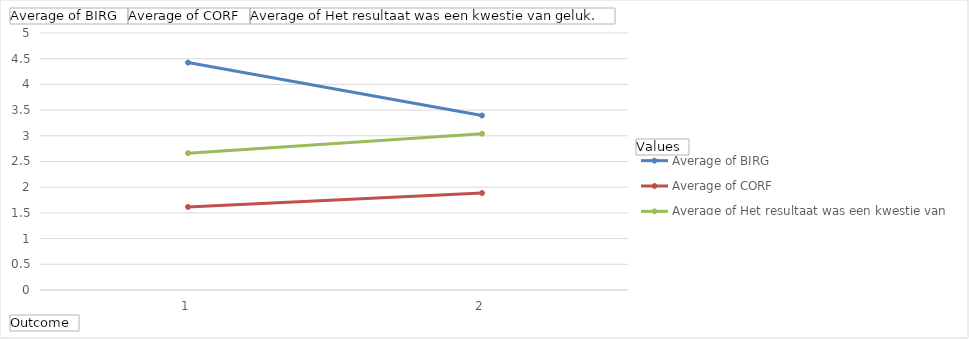
| Category | Average of BIRG | Average of CORF | Average of Het resultaat was een kwestie van geluk.  |
|---|---|---|---|
| 1 | 4.424 | 1.616 | 2.662 |
| 2 | 3.395 | 1.886 | 3.041 |